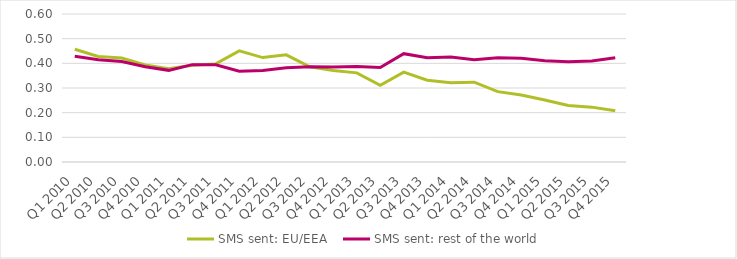
| Category | SMS sent: EU/EEA | SMS sent: rest of the world |
|---|---|---|
| Q1 2010 | 0.457 | 0.429 |
| Q2 2010 | 0.427 | 0.415 |
| Q3 2010 | 0.422 | 0.407 |
| Q4 2010 | 0.393 | 0.386 |
| Q1 2011 | 0.378 | 0.372 |
| Q2 2011 | 0.392 | 0.395 |
| Q3 2011 | 0.398 | 0.394 |
| Q4 2011 | 0.451 | 0.368 |
| Q1 2012 | 0.423 | 0.371 |
| Q2 2012 | 0.435 | 0.382 |
| Q3 2012 | 0.386 | 0.387 |
| Q4 2012 | 0.371 | 0.386 |
| Q1 2013 | 0.361 | 0.387 |
| Q2 2013 | 0.311 | 0.383 |
| Q3 2013 | 0.364 | 0.439 |
| Q4 2013 | 0.332 | 0.422 |
| Q1 2014 | 0.321 | 0.425 |
| Q2 2014 | 0.323 | 0.415 |
| Q3 2014 | 0.285 | 0.422 |
| Q4 2014 | 0.272 | 0.42 |
| Q1 2015 | 0.252 | 0.41 |
| Q2 2015 | 0.229 | 0.406 |
| Q3 2015 | 0.222 | 0.41 |
| Q4 2015 | 0.208 | 0.423 |